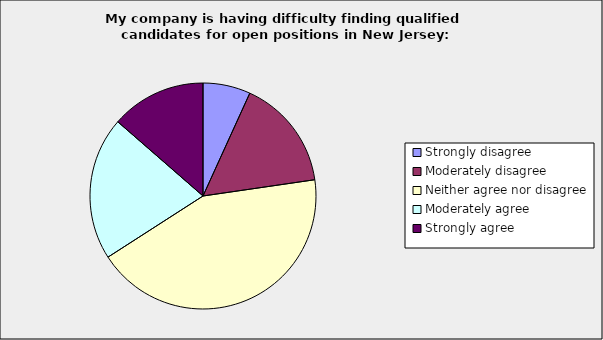
| Category | Series 0 |
|---|---|
| Strongly disagree | 0.068 |
| Moderately disagree | 0.159 |
| Neither agree nor disagree | 0.432 |
| Moderately agree | 0.205 |
| Strongly agree | 0.136 |